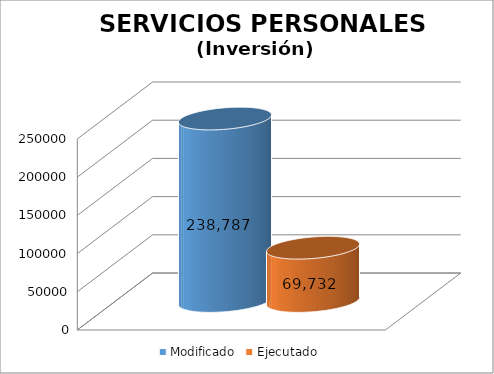
| Category | Modificado | Ejecutado |
|---|---|---|
| 0 | 238787 | 69731.93 |